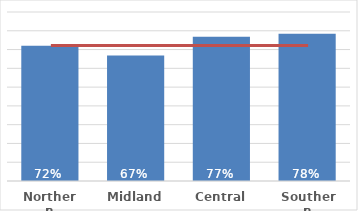
| Category | Māori |
|---|---|
| Northern | 0.72 |
| Midland | 0.668 |
| Central | 0.769 |
| Southern | 0.785 |